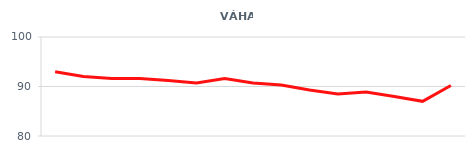
| Category | Series 0 |
|---|---|
| 6/1/12 | 93 |
| 6/2/12 | 92 |
| 6/3/12 | 91.6 |
| 6/4/12 | 91.6 |
| 6/5/12 | 91.2 |
| 6/6/12 | 90.7 |
| 6/7/12 | 91.6 |
| 6/8/12 | 90.7 |
| 6/9/12 | 90.3 |
| 6/10/12 | 89.3 |
| 6/11/12 | 88.5 |
| 6/12/12 | 88.9 |
| 6/13/12 | 88 |
| 6/14/12 | 87 |
| 6/15/12 | 90.2 |